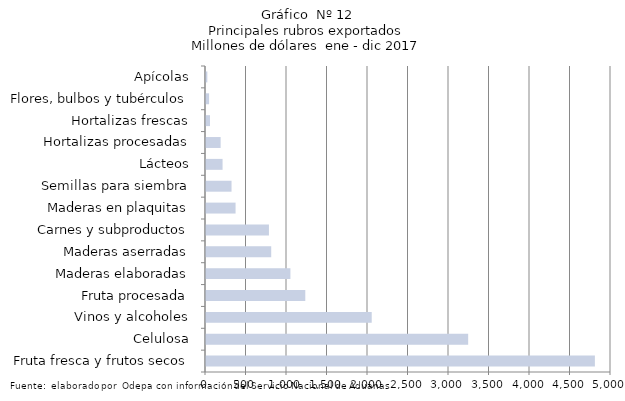
| Category | Series 7 |
|---|---|
| Fruta fresca y frutos secos | 4801185.344 |
| Celulosa | 3236541.183 |
| Vinos y alcoholes | 2045865.567 |
| Fruta procesada | 1225791.243 |
| Maderas elaboradas | 1042086.123 |
| Maderas aserradas | 805068.975 |
| Carnes y subproductos | 776991.495 |
| Maderas en plaquitas | 364970.698 |
| Semillas para siembra | 315168.283 |
| Lácteos | 204530.259 |
| Hortalizas procesadas | 180577.058 |
| Hortalizas frescas | 49599.01 |
| Flores, bulbos y tubérculos | 37982.881 |
| Apícolas | 16434.041 |